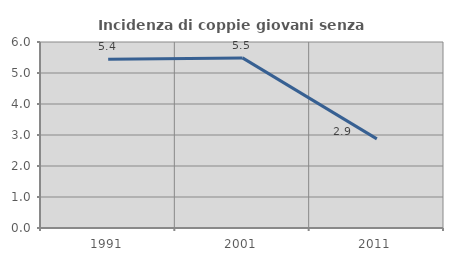
| Category | Incidenza di coppie giovani senza figli |
|---|---|
| 1991.0 | 5.444 |
| 2001.0 | 5.488 |
| 2011.0 | 2.875 |